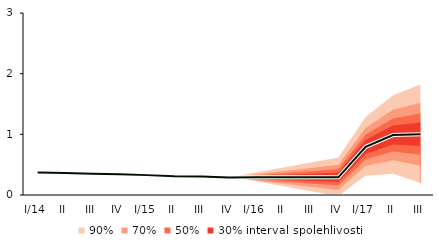
| Category | linka | Centerline |
|---|---|---|
| I/14 | 0.372 | 0.372 |
| II | 0.363 | 0.363 |
| III | 0.35 | 0.35 |
| IV | 0.344 | 0.344 |
| I/15 | 0.328 | 0.328 |
| II | 0.31 | 0.31 |
| III | 0.306 | 0.306 |
| IV | 0.29 | 0.29 |
| I/16 | 0.291 | 0.291 |
| II | 0.291 | 0.291 |
| III | 0.291 | 0.291 |
| IV | 0.291 | 0.291 |
| I/17 | 0.795 | 0.795 |
| II | 0.988 | 0.988 |
| III | 1.002 | 1.002 |